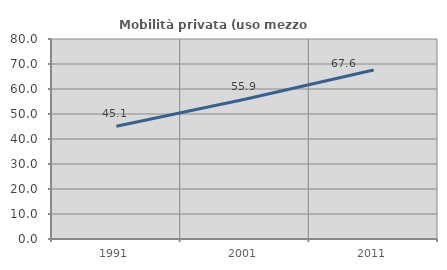
| Category | Mobilità privata (uso mezzo privato) |
|---|---|
| 1991.0 | 45.088 |
| 2001.0 | 55.9 |
| 2011.0 | 67.568 |